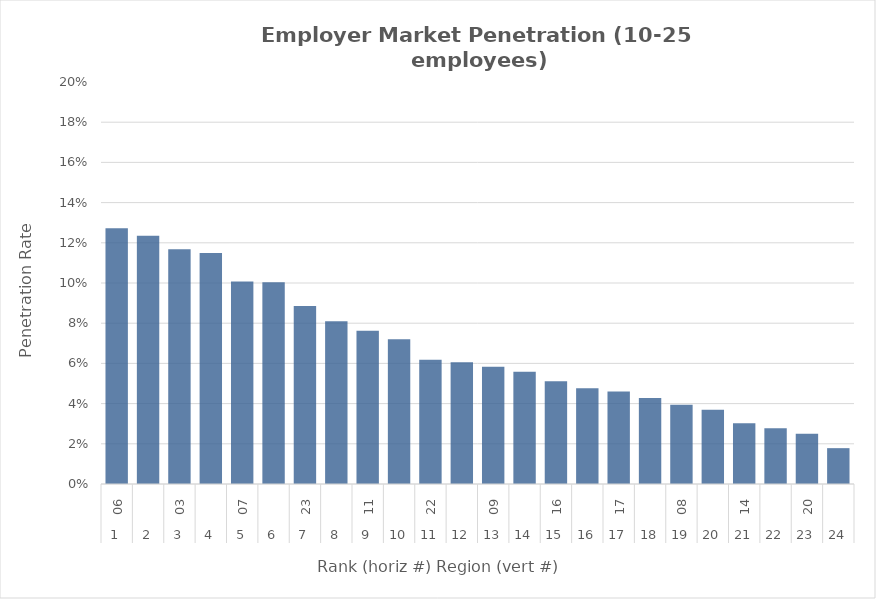
| Category | Rate |
|---|---|
| 0 | 0.127 |
| 1 | 0.123 |
| 2 | 0.117 |
| 3 | 0.115 |
| 4 | 0.101 |
| 5 | 0.1 |
| 6 | 0.088 |
| 7 | 0.081 |
| 8 | 0.076 |
| 9 | 0.072 |
| 10 | 0.062 |
| 11 | 0.061 |
| 12 | 0.058 |
| 13 | 0.056 |
| 14 | 0.051 |
| 15 | 0.048 |
| 16 | 0.046 |
| 17 | 0.043 |
| 18 | 0.039 |
| 19 | 0.037 |
| 20 | 0.03 |
| 21 | 0.028 |
| 22 | 0.025 |
| 23 | 0.018 |